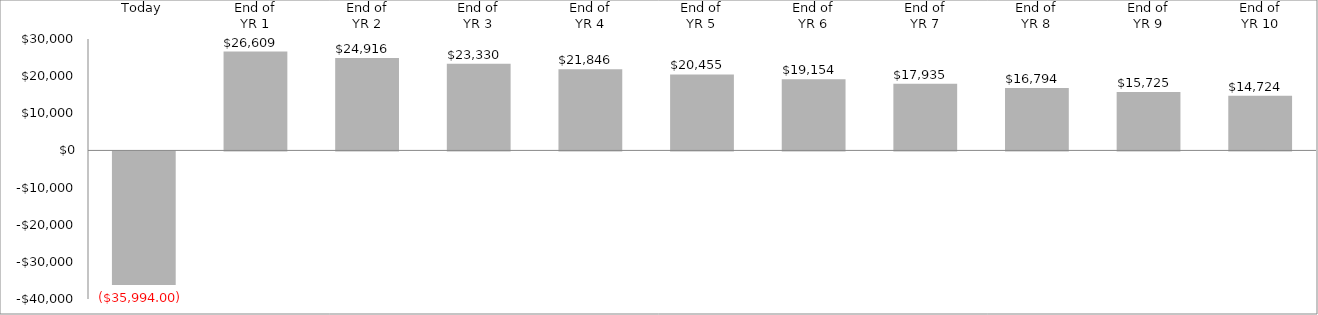
| Category | ($35,994.00) $26,609  $24,916  $23,330  $21,846  $20,455  $19,154  $17,935  $16,794  $15,725  $14,724  |
|---|---|
| Today | -35994 |
| End of
YR 1 | 26609.091 |
| End of
YR 2 | 24915.785 |
| End of
YR 3 | 23330.235 |
| End of
YR 4 | 21845.584 |
| End of
YR 5 | 20455.41 |
| End of
YR 6 | 19153.702 |
| End of
YR 7 | 17934.83 |
| End of
YR 8 | 16793.523 |
| End of
YR 9 | 15724.844 |
| End of
YR 10 | 14724.172 |